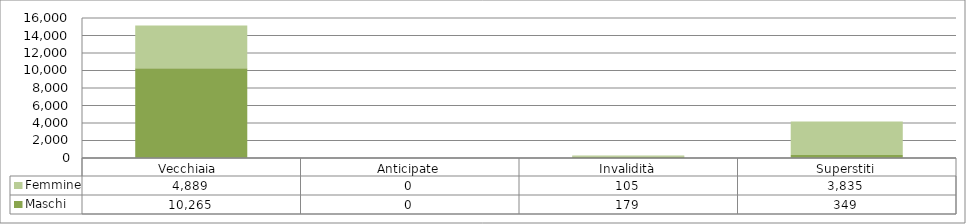
| Category | Maschi | Femmine |
|---|---|---|
| Vecchiaia  | 10265 | 4889 |
| Anticipate | 0 | 0 |
| Invalidità | 179 | 105 |
| Superstiti | 349 | 3835 |